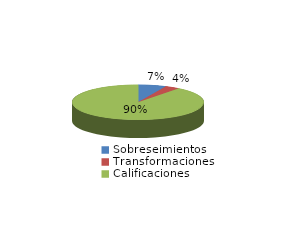
| Category | Series 0 |
|---|---|
| Sobreseimientos | 44 |
| Transformaciones | 23 |
| Calificaciones | 574 |